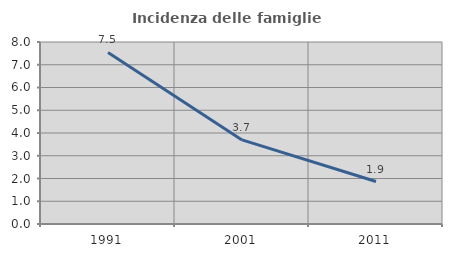
| Category | Incidenza delle famiglie numerose |
|---|---|
| 1991.0 | 7.544 |
| 2001.0 | 3.697 |
| 2011.0 | 1.866 |